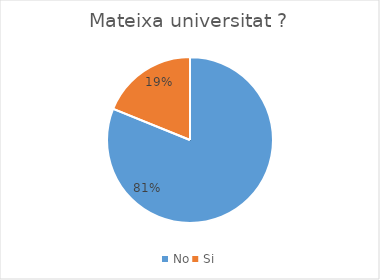
| Category | Series 0 |
|---|---|
| No | 43 |
| Si | 10 |